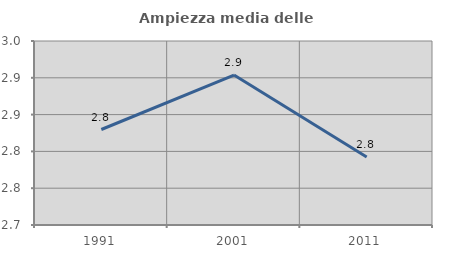
| Category | Ampiezza media delle famiglie |
|---|---|
| 1991.0 | 2.83 |
| 2001.0 | 2.904 |
| 2011.0 | 2.792 |